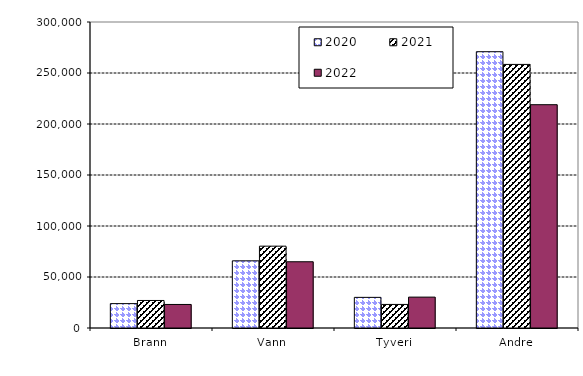
| Category | 2020 | 2021 | 2022 |
|---|---|---|---|
| Brann | 23897.272 | 26988.177 | 23072.145 |
| Vann | 65851.136 | 80225.35 | 64941.458 |
| Tyveri | 30032.017 | 23104.743 | 30272.806 |
| Andre | 270870.856 | 258418.53 | 218923.658 |